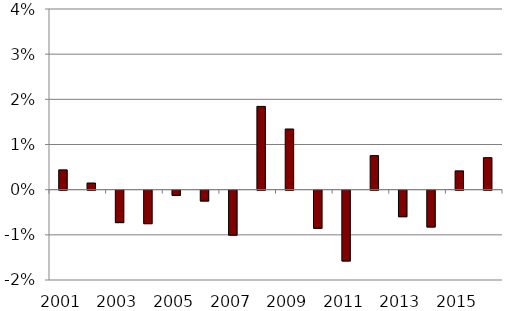
| Category | Series 0 |
|---|---|
| 2001.0 | 0.004 |
| 2002.0 | 0.001 |
| 2003.0 | -0.007 |
| 2004.0 | -0.007 |
| 2005.0 | -0.001 |
| 2006.0 | -0.002 |
| 2007.0 | -0.01 |
| 2008.0 | 0.018 |
| 2009.0 | 0.013 |
| 2010.0 | -0.008 |
| 2011.0 | -0.016 |
| 2012.0 | 0.008 |
| 2013.0 | -0.006 |
| 2014.0 | -0.008 |
| 2015.0 | 0.004 |
| 2016.0 | 0.007 |